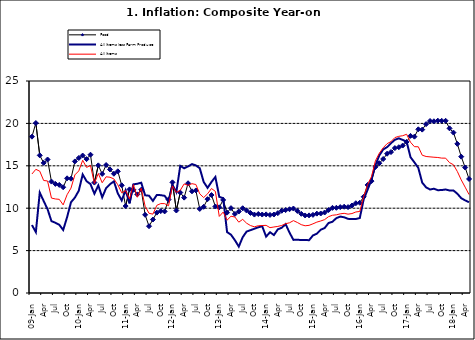
| Category | Food | All Items less Farm Produce | All Items |
|---|---|---|---|
| 09-Jan | 18.436 | 8.013 | 14.034 |
| Feb | 20.041 | 7.178 | 14.584 |
| Mar | 16.233 | 11.842 | 14.366 |
| Apr | 15.342 | 10.85 | 13.268 |
| May | 15.74 | 9.88 | 13.212 |
| June | 13.138 | 8.472 | 11.194 |
| Jul | 12.867 | 8.285 | 11.09 |
| Aug | 12.746 | 8.044 | 11.046 |
| Sep | 12.472 | 7.431 | 10.39 |
| Oct | 13.524 | 8.933 | 11.588 |
| Nov | 13.482 | 10.702 | 12.368 |
| Dec | 15.518 | 11.249 | 13.93 |
| 10-Jan | 15.918 | 12.063 | 14.398 |
| Feb | 16.208 | 13.978 | 15.649 |
| Mar | 15.79 | 13.184 | 14.812 |
| Apr | 16.306 | 12.844 | 15.044 |
| May | 13.023 | 11.711 | 12.915 |
| Jun | 15.053 | 12.686 | 14.099 |
| Jul | 14.043 | 11.287 | 13.002 |
| Aug | 15.09 | 12.366 | 13.702 |
| Sep | 14.57 | 12.83 | 13.65 |
| Oct | 14.065 | 13.168 | 13.45 |
| Nov | 14.351 | 11.746 | 12.766 |
| Dec | 12.701 | 10.917 | 11.815 |
| 11-Jan | 10.255 | 12.118 | 12.08 |
| Feb | 12.221 | 10.569 | 11.1 |
| Mar | 12.169 | 12.815 | 12.779 |
| Apr | 11.629 | 12.882 | 11.291 |
| May | 12.179 | 13.006 | 12.352 |
| Jun | 9.22 | 11.524 | 10.23 |
| Jul | 7.877 | 11.472 | 9.397 |
| Aug | 8.665 | 10.863 | 9.301 |
| Sep | 9.479 | 11.567 | 10.339 |
| Oct | 9.656 | 11.539 | 10.544 |
| Nov | 9.623 | 11.459 | 10.54 |
| Dec | 11.02 | 10.822 | 10.283 |
| 12-Jan | 13.053 | 12.748 | 12.626 |
| 12-Feb | 9.729 | 11.901 | 11.866 |
| 12-Mar | 11.848 | 14.995 | 12.111 |
| Apr | 11.246 | 14.703 | 12.866 |
| May | 12.942 | 14.926 | 12.688 |
| Jun | 11.991 | 15.199 | 12.892 |
| Jul | 12.093 | 15.045 | 12.797 |
| Aug | 9.91 | 14.714 | 11.689 |
| Sep | 10.164 | 13.101 | 11.253 |
| Oct | 11.064 | 12.398 | 11.693 |
| Nov | 11.553 | 13.092 | 12.32 |
| Dec | 10.199 | 13.685 | 11.981 |
| 13-Jan | 10.106 | 11.342 | 9.031 |
| Feb | 10.973 | 11.184 | 9.542 |
| Mar | 9.482 | 7.179 | 8.593 |
| Apr | 10.006 | 6.874 | 9.052 |
| May | 9.321 | 6.227 | 8.964 |
| Jun | 9.606 | 5.472 | 8.353 |
| Jul | 9.994 | 6.58 | 8.682 |
| Aug | 9.723 | 7.245 | 8.231 |
| Sep | 9.437 | 7.41 | 7.952 |
| Oct | 9.249 | 7.579 | 7.807 |
| Nov | 9.313 | 7.75 | 7.931 |
| Dec | 9.253 | 7.872 | 7.957 |
| 14-Jan | 9.271 | 6.648 | 7.977 |
| Feb | 9.207 | 7.166 | 7.707 |
| Mar | 9.254 | 6.836 | 7.783 |
| Apr | 9.414 | 7.508 | 7.851 |
| May | 9.698 | 7.693 | 7.965 |
| Jun | 9.776 | 8.122 | 8.167 |
| Jul | 9.878 | 7.116 | 8.281 |
| Aug | 9.959 | 6.264 | 8.534 |
| Sep | 9.676 | 6.278 | 8.317 |
| Oct | 9.343 | 6.252 | 8.06 |
| Nov | 9.144 | 6.255 | 7.927 |
| Dec | 9.152 | 6.225 | 7.978 |
| 15-Jan | 9.215 | 6.787 | 8.157 |
| Feb | 9.359 | 6.994 | 8.359 |
| Mar | 9.376 | 7.46 | 8.494 |
| Apr | 9.49 | 7.661 | 8.655 |
| May | 9.782 | 8.253 | 9.003 |
| Jun | 10.041 | 8.403 | 9.168 |
| Jul | 10.049 | 8.83 | 9.218 |
| Aug | 10.131 | 9.01 | 9.336 |
| Sep | 10.174 | 8.928 | 9.394 |
| Oct | 10.129 | 8.742 | 9.296 |
| Nov | 10.321 | 8.732 | 9.368 |
| Dec | 10.588 | 8.727 | 9.554 |
| 16-Jan | 10.642 | 8.841 | 9.617 |
| Feb | 11.348 | 11.041 | 11.379 |
| Mar | 12.745 | 12.17 | 12.775 |
| Apr | 13.194 | 13.352 | 13.721 |
| May | 14.861 | 15.054 | 15.577 |
| Jun | 15.302 | 16.224 | 16.48 |
| Jul | 15.799 | 16.929 | 17.127 |
| Aug | 16.427 | 17.208 | 17.609 |
| Sep | 16.622 | 17.666 | 17.852 |
| Oct | 17.09 | 18.067 | 18.33 |
| Nov | 17.191 | 18.241 | 18.476 |
| Dec | 17.388 | 18.052 | 18.547 |
| 17-Jan | 17.818 | 17.867 | 18.719 |
| Feb | 18.528 | 16.011 | 17.78 |
| Mar | 18.436 | 15.404 | 17.256 |
| Apr | 19.303 | 14.75 | 17.244 |
| May | 19.266 | 13.016 | 16.251 |
| Jun | 19.915 | 12.455 | 16.098 |
| Jul | 20.284 | 12.207 | 16.053 |
| Aug | 20.251 | 12.296 | 16.012 |
| Sep | 20.321 | 12.123 | 15.979 |
| Oct | 20.306 | 12.142 | 15.905 |
| Nov | 20.308 | 12.206 | 15.901 |
| Dec | 19.415 | 12.089 | 15.372 |
| 18-Jan | 18.919 | 12.09 | 15.127 |
| Feb | 17.588 | 11.707 | 14.33 |
| Mar | 16.08 | 11.181 | 13.337 |
| Apr | 14.799 | 10.92 | 12.482 |
| May | 13.448 | 10.71 | 11.608 |